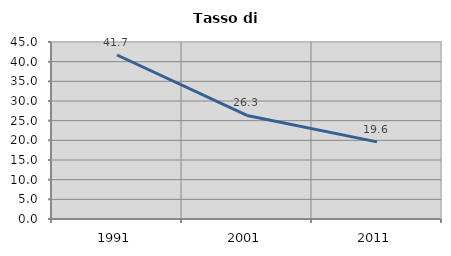
| Category | Tasso di disoccupazione   |
|---|---|
| 1991.0 | 41.694 |
| 2001.0 | 26.329 |
| 2011.0 | 19.613 |